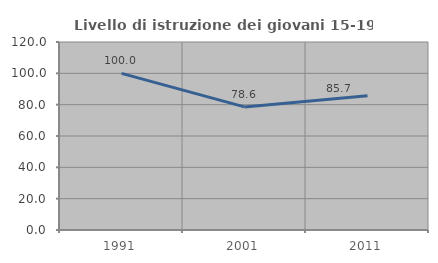
| Category | Livello di istruzione dei giovani 15-19 anni |
|---|---|
| 1991.0 | 100 |
| 2001.0 | 78.571 |
| 2011.0 | 85.714 |